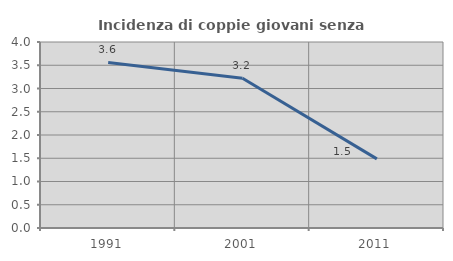
| Category | Incidenza di coppie giovani senza figli |
|---|---|
| 1991.0 | 3.561 |
| 2001.0 | 3.219 |
| 2011.0 | 1.487 |